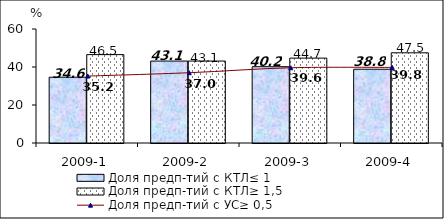
| Category | Доля предп-тий с КТЛ≤ 1 | Доля предп-тий с КТЛ≥ 1,5 |
|---|---|---|
| 2009-1 | 34.628 | 46.515 |
| 2009-2 | 43.128 | 43.128 |
| 2009-3 | 40.161 | 44.677 |
| 2009-4 | 38.825 | 47.471 |